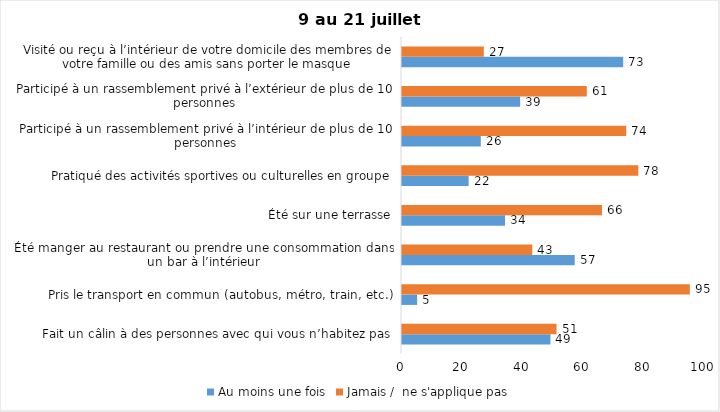
| Category | Au moins une fois | Jamais /  ne s'applique pas |
|---|---|---|
| Fait un câlin à des personnes avec qui vous n’habitez pas | 49 | 51 |
| Pris le transport en commun (autobus, métro, train, etc.) | 5 | 95 |
| Été manger au restaurant ou prendre une consommation dans un bar à l’intérieur | 57 | 43 |
| Été sur une terrasse | 34 | 66 |
| Pratiqué des activités sportives ou culturelles en groupe | 22 | 78 |
| Participé à un rassemblement privé à l’intérieur de plus de 10 personnes | 26 | 74 |
| Participé à un rassemblement privé à l’extérieur de plus de 10 personnes | 39 | 61 |
| Visité ou reçu à l’intérieur de votre domicile des membres de votre famille ou des amis sans porter le masque | 73 | 27 |